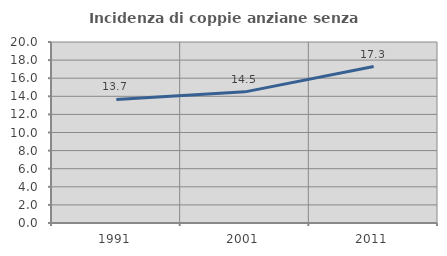
| Category | Incidenza di coppie anziane senza figli  |
|---|---|
| 1991.0 | 13.65 |
| 2001.0 | 14.491 |
| 2011.0 | 17.286 |